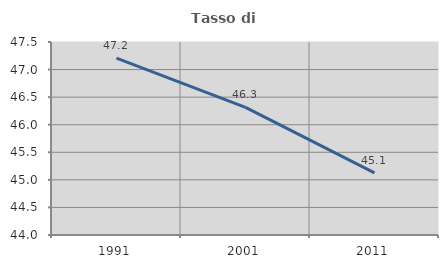
| Category | Tasso di occupazione   |
|---|---|
| 1991.0 | 47.209 |
| 2001.0 | 46.316 |
| 2011.0 | 45.126 |